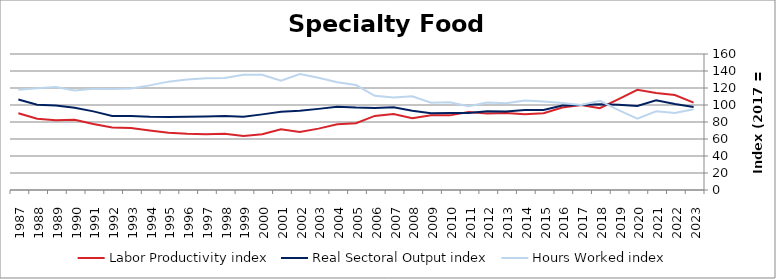
| Category | Labor Productivity index | Real Sectoral Output index | Hours Worked index |
|---|---|---|---|
| 2023.0 | 102.762 | 97.7 | 95.074 |
| 2022.0 | 111.763 | 101.118 | 90.475 |
| 2021.0 | 114.184 | 105.63 | 92.508 |
| 2020.0 | 117.953 | 98.97 | 83.907 |
| 2019.0 | 106.822 | 100.36 | 93.951 |
| 2018.0 | 96.228 | 100.881 | 104.836 |
| 2017.0 | 100 | 100 | 100 |
| 2016.0 | 97.067 | 99.414 | 102.418 |
| 2015.0 | 90.383 | 94.197 | 104.22 |
| 2014.0 | 89.2 | 93.995 | 105.375 |
| 2013.0 | 90.572 | 92.478 | 102.104 |
| 2012.0 | 89.967 | 92.641 | 102.972 |
| 2011.0 | 91.746 | 90.534 | 98.679 |
| 2010.0 | 87.797 | 90.726 | 103.336 |
| 2009.0 | 87.907 | 90.326 | 102.752 |
| 2008.0 | 84.509 | 93.132 | 110.204 |
| 2007.0 | 89.467 | 97.394 | 108.861 |
| 2006.0 | 87.149 | 96.599 | 110.843 |
| 2005.0 | 78.517 | 96.964 | 123.495 |
| 2004.0 | 77.263 | 98.016 | 126.86 |
| 2003.0 | 72.208 | 95.436 | 132.167 |
| 2002.0 | 68.347 | 93.26 | 136.451 |
| 2001.0 | 71.443 | 91.949 | 128.704 |
| 2000.0 | 65.639 | 88.967 | 135.539 |
| 1999.0 | 63.515 | 86.193 | 135.705 |
| 1998.0 | 66.12 | 87.176 | 131.846 |
| 1997.0 | 65.731 | 86.442 | 131.509 |
| 1996.0 | 66.149 | 86.03 | 130.055 |
| 1995.0 | 67.429 | 85.958 | 127.479 |
| 1994.0 | 70.038 | 86.204 | 123.082 |
| 1993.0 | 72.958 | 87.164 | 119.471 |
| 1992.0 | 73.406 | 87.125 | 118.69 |
| 1991.0 | 77.582 | 92.49 | 119.216 |
| 1990.0 | 82.743 | 96.8 | 116.988 |
| 1989.0 | 82.058 | 99.492 | 121.247 |
| 1988.0 | 83.903 | 100.361 | 119.615 |
| 1987.0 | 90.361 | 106.46 | 117.817 |